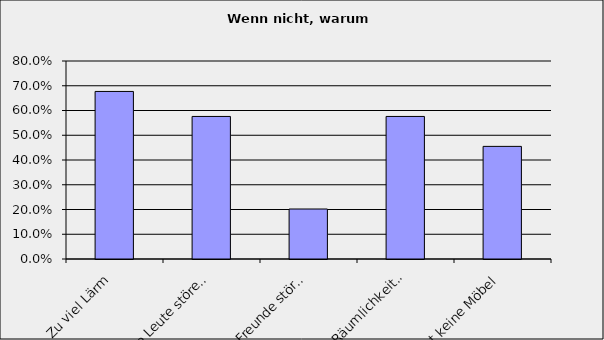
| Category | Series 0 |
|---|---|
| Zu viel Lärm | 0.677 |
| Andere Leute stören mich | 0.576 |
| Meine Freunde stören mich | 0.202 |
| keine Räumlichkeiten zur Verfügung | 0.576 |
| Es gibt keine Möbel | 0.455 |